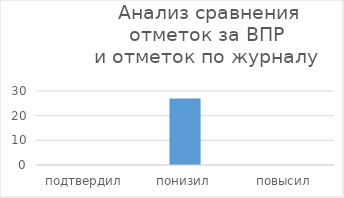
| Category | Series 0 |
|---|---|
| подтвердил | 0 |
| понизил | 27 |
| повысил | 0 |